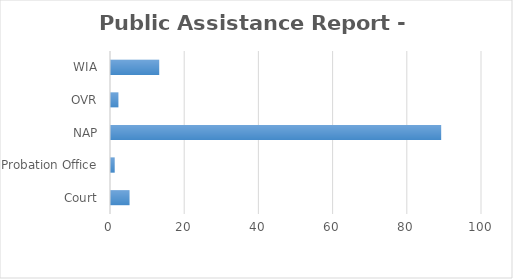
| Category | Series 0 |
|---|---|
| Court | 5 |
| Probation Office | 1 |
| NAP | 89 |
| OVR | 2 |
| WIA | 13 |